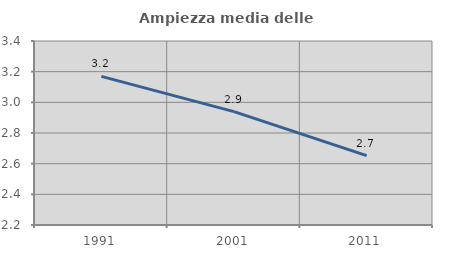
| Category | Ampiezza media delle famiglie |
|---|---|
| 1991.0 | 3.169 |
| 2001.0 | 2.94 |
| 2011.0 | 2.653 |